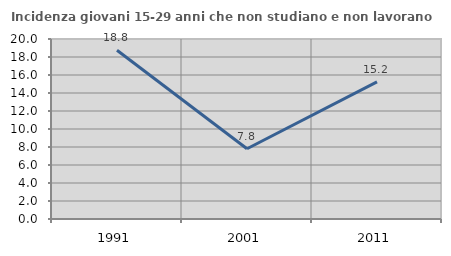
| Category | Incidenza giovani 15-29 anni che non studiano e non lavorano  |
|---|---|
| 1991.0 | 18.75 |
| 2001.0 | 7.805 |
| 2011.0 | 15.244 |